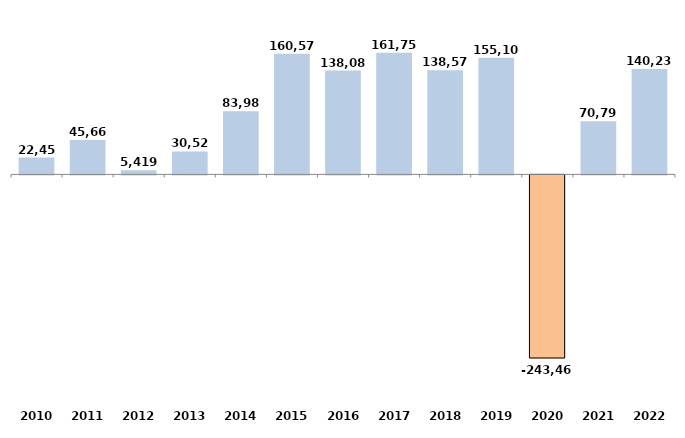
| Category | Series 0 |
|---|---|
| 2010 | 22457.24 |
| 2011 | 45659.91 |
| 2012 | 5418.88 |
| 2013 | 30528.24 |
| 2014 | 83984.43 |
| 2015 | 160578.9 |
| 2016 | 138085.97 |
| 2017 | 161751.78 |
| 2018 | 138573.4 |
| 2019 | 155104.43 |
| 2020 | -243469 |
| 2021 | 70790 |
| 2022 | 140231.646 |